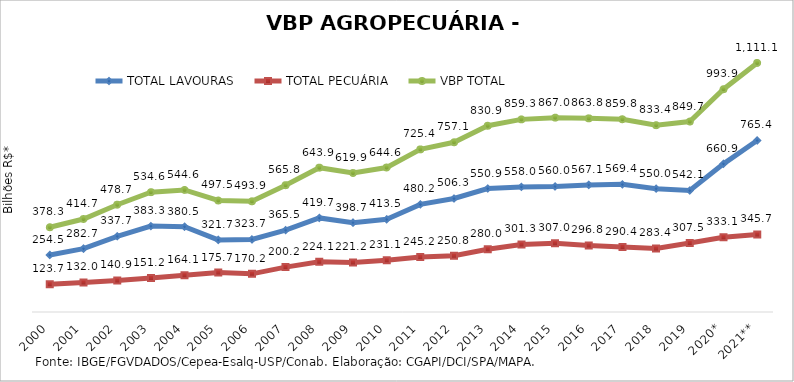
| Category | TOTAL LAVOURAS | TOTAL PECUÁRIA | VBP TOTAL |
|---|---|---|---|
| 2000 | 254.536 | 123.727 | 378.263 |
| 2001 | 282.742 | 132.001 | 414.744 |
| 2002 | 337.745 | 140.912 | 478.658 |
| 2003 | 383.339 | 151.245 | 534.583 |
| 2004 | 380.532 | 164.057 | 544.589 |
| 2005 | 321.722 | 175.745 | 497.468 |
| 2006 | 323.688 | 170.211 | 493.899 |
| 2007 | 365.547 | 200.244 | 565.791 |
| 2008 | 419.738 | 224.121 | 643.859 |
| 2009 | 398.695 | 221.206 | 619.901 |
| 2010 | 413.491 | 231.117 | 644.608 |
| 2011 | 480.219 | 245.156 | 725.375 |
| 2012 | 506.332 | 250.78 | 757.113 |
| 2013 | 550.893 | 279.966 | 830.859 |
| 2014 | 557.981 | 301.323 | 859.304 |
| 2015 | 560.005 | 306.966 | 866.971 |
| 2016 | 567.087 | 296.759 | 863.846 |
| 2017 | 569.441 | 290.383 | 859.824 |
| 2018 | 550.048 | 283.36 | 833.408 |
| 2019 | 542.138 | 307.527 | 849.665 |
| 2020* | 660.879 | 333.051 | 993.93 |
| 2021** | 765.352 | 345.736 | 1111.088 |